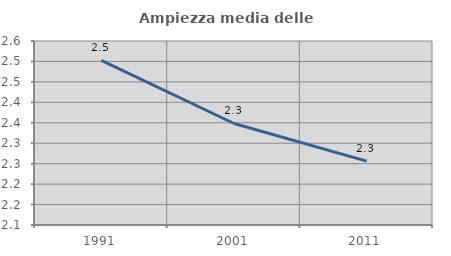
| Category | Ampiezza media delle famiglie |
|---|---|
| 1991.0 | 2.503 |
| 2001.0 | 2.348 |
| 2011.0 | 2.256 |